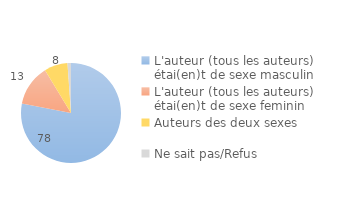
| Category | Series 0 |
|---|---|
| L'auteur (tous les auteurs) étai(en)t de sexe masculin | 78.01 |
| L'auteur (tous les auteurs) étai(en)t de sexe feminin | 13.308 |
| Auteurs des deux sexes | 7.557 |
| Ne sait pas/Refus | 1.125 |